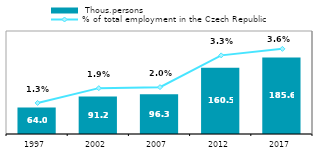
| Category |  Thous.persons |
|---|---|
| 1997.0 | 64.033 |
| 2002.0 | 91.214 |
| 2007.0 | 96.294 |
| 2012.0 | 160.507 |
| 2017.0 | 185.628 |